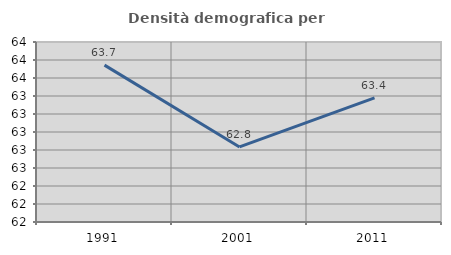
| Category | Densità demografica |
|---|---|
| 1991.0 | 63.743 |
| 2001.0 | 62.834 |
| 2011.0 | 63.379 |